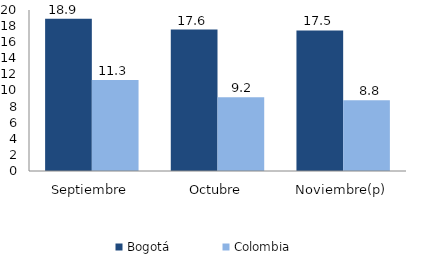
| Category | Bogotá | Colombia |
|---|---|---|
| Septiembre | 18.914 | 11.29 |
| Octubre | 17.572 | 9.176 |
| Noviembre(p) | 17.459 | 8.795 |